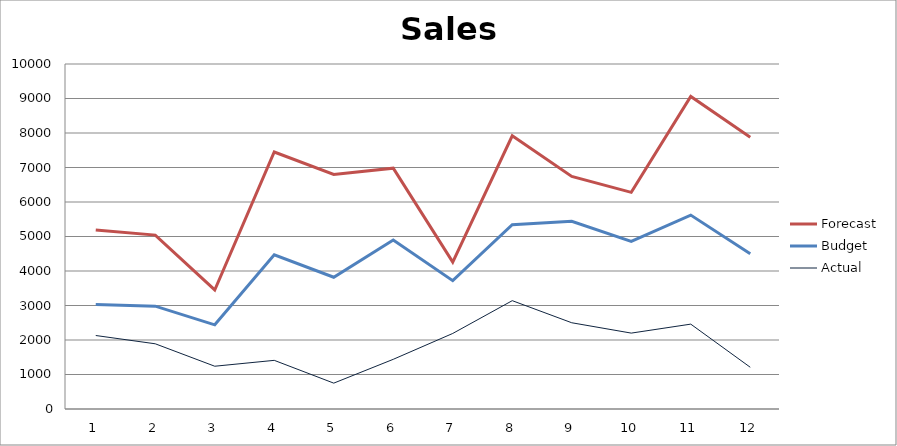
| Category | Actual | Budget | Forecast |
|---|---|---|---|
| 0 | 2130 | 900 | 2160 |
| 1 | 1890 | 1090 | 2060 |
| 2 | 1240 | 1200 | 1010 |
| 3 | 1410 | 3060 | 2980 |
| 4 | 750 | 3070 | 2980 |
| 5 | 1440 | 3460 | 2080 |
| 6 | 2190 | 1530 | 540 |
| 7 | 3140 | 2200 | 2580 |
| 8 | 2500 | 2940 | 1300 |
| 9 | 2200 | 2660 | 1420 |
| 10 | 2460 | 3160 | 3440 |
| 11 | 1210 | 3290 | 3380 |